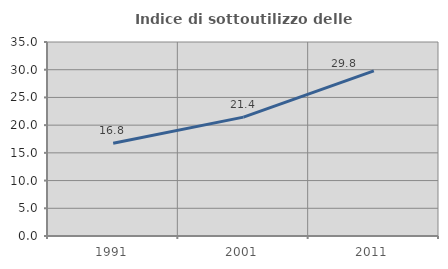
| Category | Indice di sottoutilizzo delle abitazioni  |
|---|---|
| 1991.0 | 16.75 |
| 2001.0 | 21.446 |
| 2011.0 | 29.803 |